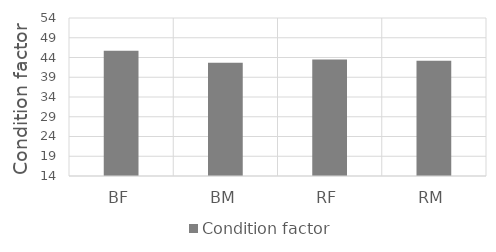
| Category | Condition factor |
|---|---|
| BF | 45.7 |
| BM | 42.7 |
| RF | 43.5 |
| RM | 43.2 |